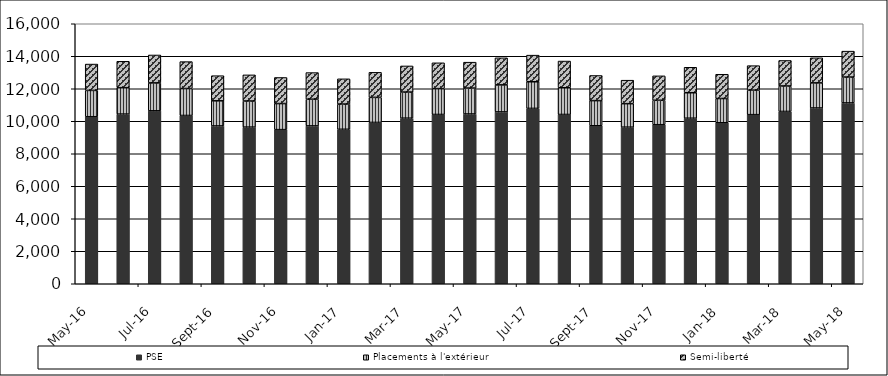
| Category | PSE | Placements à l'extérieur | Semi-liberté |
|---|---|---|---|
| 2016-05-01 | 10278 | 1621 | 1621 |
| 2016-06-01 | 10441 | 1625 | 1625 |
| 2016-07-01 | 10642 | 1718 | 1718 |
| 2016-08-01 | 10355 | 1658 | 1658 |
| 2016-09-01 | 9712 | 1546 | 1546 |
| 2016-10-01 | 9640 | 1607 | 1607 |
| 2016-11-01 | 9484 | 1605 | 1605 |
| 2016-12-01 | 9714 | 1641 | 1641 |
| 2017-01-01 | 9505 | 1553 | 1553 |
| 2017-02-01 | 9927 | 1542 | 1542 |
| 2017-03-01 | 10190 | 1607 | 1607 |
| 2017-04-01 | 10417 | 1590 | 1590 |
| 2017-05-01 | 10448 | 1594 | 1594 |
| 2017-06-01 | 10575 | 1664 | 1664 |
| 2017-07-01 | 10791 | 1639 | 1639 |
| 2017-08-01 | 10417 | 1644 | 1644 |
| 2017-09-01 | 9723 | 1547 | 1547 |
| 2017-10-01 | 9637 | 1445 | 1445 |
| 2017-11-01 | 9787 | 1504 | 1504 |
| 2017-12-01 | 10187 | 1568 | 1568 |
| 2018-01-01 | 9907 | 1493 | 1493 |
| 2018-02-01 | 10406 | 1508 | 1508 |
| 2018-03-01 | 10603 | 1569 | 1569 |
| 2018-04-01 | 10817 | 1544 | 1544 |
| 2018-05-01 | 11127 | 1594 | 1594 |